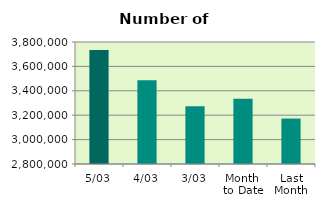
| Category | Series 0 |
|---|---|
| 5/03 | 3733402 |
| 4/03 | 3486224 |
| 3/03 | 3273090 |
| Month 
to Date | 3334229.6 |
| Last
Month | 3172414.4 |